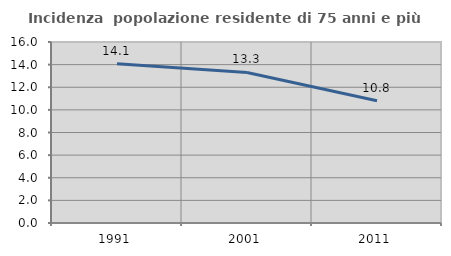
| Category | Incidenza  popolazione residente di 75 anni e più |
|---|---|
| 1991.0 | 14.071 |
| 2001.0 | 13.307 |
| 2011.0 | 10.809 |